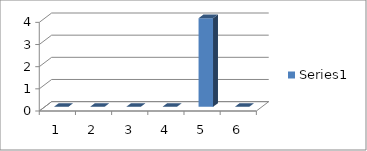
| Category | Series 0 |
|---|---|
| 0 | 0 |
| 1 | 0 |
| 2 | 0 |
| 3 | 0 |
| 4 | 4 |
| 5 | 0 |